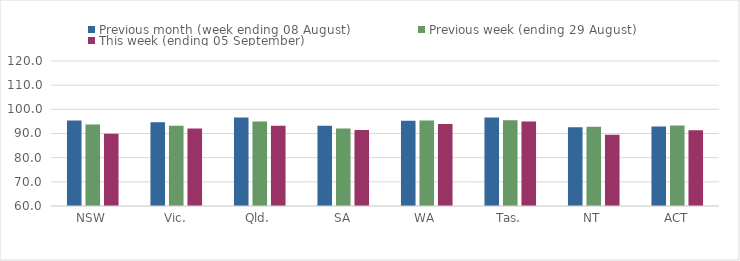
| Category | Previous month (week ending 08 August) | Previous week (ending 29 August) | This week (ending 05 September) |
|---|---|---|---|
| NSW | 95.41 | 93.75 | 89.93 |
| Vic. | 94.66 | 93.25 | 92.12 |
| Qld. | 96.6 | 94.97 | 93.24 |
| SA | 93.21 | 92.02 | 91.48 |
| WA | 95.32 | 95.39 | 93.96 |
| Tas. | 96.62 | 95.52 | 94.96 |
| NT | 92.58 | 92.8 | 89.52 |
| ACT | 92.88 | 93.35 | 91.35 |